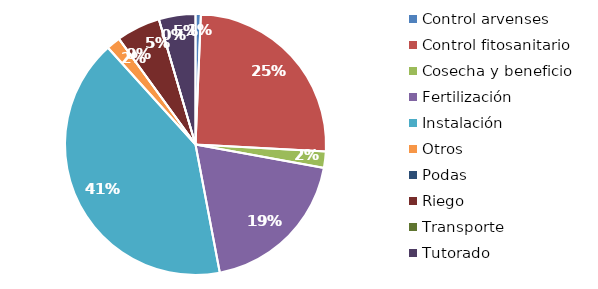
| Category | Valor |
|---|---|
| Control arvenses | 815940 |
| Control fitosanitario | 31144050 |
| Cosecha y beneficio | 2513641.199 |
| Fertilización | 23677167 |
| Instalación | 51058336.851 |
| Otros | 2132107 |
| Podas | 0 |
| Riego | 6732967 |
| Transporte | 0 |
| Tutorado | 5610806 |